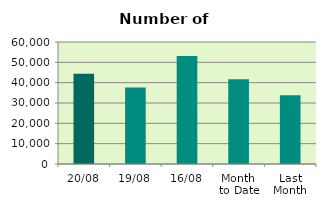
| Category | Series 0 |
|---|---|
| 20/08 | 44368 |
| 19/08 | 37642 |
| 16/08 | 53122 |
| Month 
to Date | 41740.429 |
| Last
Month | 33803.652 |